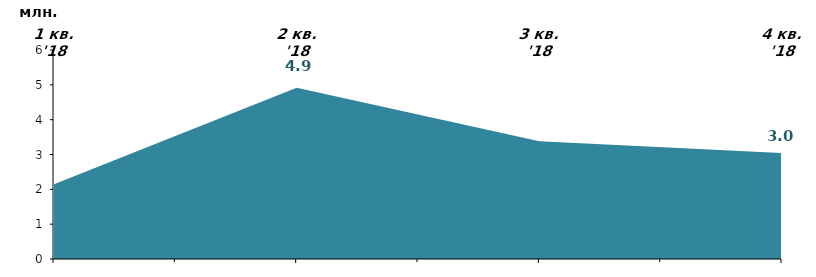
| Category | Наростаючим підсумком |
|---|---|
| 1 кв. '18 | 2.145 |
| 2 кв. '18 | 4.915 |
| 3 кв. '18 | 3.384 |
| 4 кв. '18 | 3.042 |